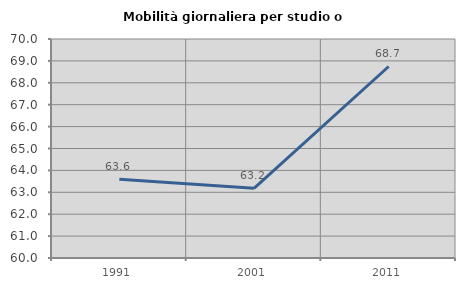
| Category | Mobilità giornaliera per studio o lavoro |
|---|---|
| 1991.0 | 63.59 |
| 2001.0 | 63.181 |
| 2011.0 | 68.745 |